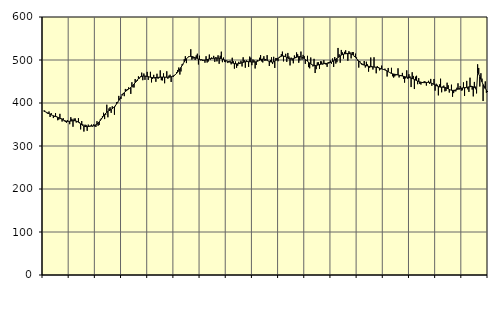
| Category | Piggar | Series 1 |
|---|---|---|
| nan | 381.7 | 381.25 |
| 87.0 | 382.6 | 380.11 |
| 87.0 | 379.4 | 379.08 |
| 87.0 | 376.4 | 377.77 |
| 87.0 | 374.8 | 376.44 |
| 87.0 | 380.2 | 375.11 |
| 87.0 | 367.5 | 373.76 |
| 87.0 | 376.6 | 372.53 |
| 87.0 | 371.6 | 371.38 |
| 87.0 | 365 | 370.36 |
| 87.0 | 367.8 | 369.47 |
| 87.0 | 376.4 | 368.62 |
| nan | 369.2 | 367.75 |
| 88.0 | 359.9 | 366.82 |
| 88.0 | 361.5 | 365.73 |
| 88.0 | 374.8 | 364.48 |
| 88.0 | 365 | 363.17 |
| 88.0 | 356.9 | 361.84 |
| 88.0 | 364.8 | 360.53 |
| 88.0 | 357.7 | 359.36 |
| 88.0 | 356 | 358.42 |
| 88.0 | 354.2 | 357.75 |
| 88.0 | 359.9 | 357.37 |
| 88.0 | 357 | 357.33 |
| nan | 350.7 | 357.54 |
| 89.0 | 367 | 357.94 |
| 89.0 | 363.1 | 358.45 |
| 89.0 | 344.8 | 358.84 |
| 89.0 | 363.7 | 358.91 |
| 89.0 | 364.2 | 358.63 |
| 89.0 | 354.6 | 357.93 |
| 89.0 | 355.9 | 356.77 |
| 89.0 | 364.7 | 355.23 |
| 89.0 | 355 | 353.4 |
| 89.0 | 338.6 | 351.46 |
| 89.0 | 358 | 349.54 |
| nan | 350.7 | 347.84 |
| 90.0 | 333.6 | 346.51 |
| 90.0 | 349.6 | 345.56 |
| 90.0 | 349 | 345.06 |
| 90.0 | 335.3 | 345.02 |
| 90.0 | 349.8 | 345.24 |
| 90.0 | 346.9 | 345.58 |
| 90.0 | 347.3 | 345.97 |
| 90.0 | 349.8 | 346.29 |
| 90.0 | 345.1 | 346.66 |
| 90.0 | 350.4 | 347.24 |
| 90.0 | 345.5 | 348.07 |
| nan | 344.3 | 349.27 |
| 91.0 | 357.7 | 350.99 |
| 91.0 | 347.1 | 353.24 |
| 91.0 | 348.9 | 356 |
| 91.0 | 361.7 | 359.19 |
| 91.0 | 364.9 | 362.67 |
| 91.0 | 369.5 | 366.3 |
| 91.0 | 377.3 | 369.9 |
| 91.0 | 362.6 | 373.23 |
| 91.0 | 372.6 | 376.14 |
| 91.0 | 396 | 378.52 |
| 91.0 | 366.8 | 380.4 |
| nan | 387.3 | 381.97 |
| 92.0 | 390.2 | 383.39 |
| 92.0 | 377.1 | 384.86 |
| 92.0 | 392.3 | 386.66 |
| 92.0 | 389.4 | 388.85 |
| 92.0 | 372.7 | 391.45 |
| 92.0 | 392.5 | 394.49 |
| 92.0 | 402 | 397.94 |
| 92.0 | 399.9 | 401.75 |
| 92.0 | 416.5 | 405.9 |
| 92.0 | 409.2 | 410.1 |
| 92.0 | 409.4 | 414.14 |
| nan | 420.6 | 417.97 |
| 93.0 | 422.9 | 421.32 |
| 93.0 | 415.9 | 424.16 |
| 93.0 | 432.7 | 426.56 |
| 93.0 | 431 | 428.57 |
| 93.0 | 432.1 | 430.4 |
| 93.0 | 436.4 | 432.25 |
| 93.0 | 434 | 434.11 |
| 93.0 | 421.2 | 436.15 |
| 93.0 | 448.3 | 438.45 |
| 93.0 | 436.4 | 441.09 |
| 93.0 | 436.1 | 444.11 |
| nan | 455.8 | 447.32 |
| 94.0 | 449.1 | 450.57 |
| 94.0 | 451.5 | 453.71 |
| 94.0 | 462 | 456.49 |
| 94.0 | 457.1 | 458.77 |
| 94.0 | 461.7 | 460.53 |
| 94.0 | 470.6 | 461.71 |
| 94.0 | 453 | 462.38 |
| 94.0 | 468.5 | 462.68 |
| 94.0 | 453.8 | 462.66 |
| 94.0 | 461.4 | 462.34 |
| 94.0 | 472.4 | 461.88 |
| nan | 453.7 | 461.25 |
| 95.0 | 460.7 | 460.54 |
| 95.0 | 472.5 | 459.93 |
| 95.0 | 447.9 | 459.44 |
| 95.0 | 455.9 | 459.15 |
| 95.0 | 465.5 | 459.08 |
| 95.0 | 457.3 | 459.11 |
| 95.0 | 449.3 | 459.23 |
| 95.0 | 468 | 459.43 |
| 95.0 | 456.3 | 459.62 |
| 95.0 | 458.7 | 459.87 |
| 95.0 | 475.9 | 460.09 |
| nan | 453 | 460.24 |
| 96.0 | 452.5 | 460.35 |
| 96.0 | 468.9 | 460.34 |
| 96.0 | 445.9 | 460.22 |
| 96.0 | 459.3 | 460.07 |
| 96.0 | 473.8 | 459.87 |
| 96.0 | 456.4 | 459.77 |
| 96.0 | 463.7 | 459.95 |
| 96.0 | 465.8 | 460.4 |
| 96.0 | 448.9 | 461.08 |
| 96.0 | 462.4 | 461.99 |
| 96.0 | 460.8 | 463.09 |
| nan | 463.4 | 464.51 |
| 97.0 | 467.3 | 466.44 |
| 97.0 | 471.6 | 468.91 |
| 97.0 | 476.8 | 471.88 |
| 97.0 | 482.5 | 475.27 |
| 97.0 | 466.2 | 478.94 |
| 97.0 | 473.4 | 482.87 |
| 97.0 | 490.1 | 487.02 |
| 97.0 | 490.1 | 491.27 |
| 97.0 | 501.8 | 495.46 |
| 97.0 | 508.8 | 499.33 |
| 97.0 | 492.8 | 502.7 |
| nan | 504.8 | 505.36 |
| 98.0 | 508.1 | 507.21 |
| 98.0 | 508.5 | 508.2 |
| 98.0 | 525 | 508.43 |
| 98.0 | 500.8 | 508.05 |
| 98.0 | 503.5 | 507.34 |
| 98.0 | 503.8 | 506.44 |
| 98.0 | 500.1 | 505.45 |
| 98.0 | 510.6 | 504.43 |
| 98.0 | 514.6 | 503.38 |
| 98.0 | 489.6 | 502.35 |
| 98.0 | 510 | 501.44 |
| nan | 499.3 | 500.72 |
| 99.0 | 501.4 | 500.16 |
| 99.0 | 497.9 | 499.8 |
| 99.0 | 498.9 | 499.65 |
| 99.0 | 493.7 | 499.78 |
| 99.0 | 508.8 | 500.23 |
| 99.0 | 494.1 | 500.95 |
| 99.0 | 496.5 | 501.8 |
| 99.0 | 512.7 | 502.55 |
| 99.0 | 500.9 | 503.13 |
| 99.0 | 505.8 | 503.52 |
| 99.0 | 504.7 | 503.81 |
| nan | 509.6 | 503.98 |
| 0.0 | 495.7 | 504.11 |
| 0.0 | 506.8 | 504.21 |
| 0.0 | 496.8 | 504.28 |
| 0.0 | 510.9 | 504.24 |
| 0.0 | 491.2 | 504.08 |
| 0.0 | 509.8 | 503.68 |
| 0.0 | 519.4 | 503.05 |
| 0.0 | 494.9 | 502.24 |
| 0.0 | 505.7 | 501.23 |
| 0.0 | 495.6 | 500.16 |
| 0.0 | 494.8 | 499.09 |
| nan | 498.1 | 498.02 |
| 1.0 | 492.9 | 496.97 |
| 1.0 | 497 | 495.96 |
| 1.0 | 498.5 | 495.01 |
| 1.0 | 489.9 | 494.11 |
| 1.0 | 505.2 | 493.21 |
| 1.0 | 497.1 | 492.43 |
| 1.0 | 479.9 | 491.74 |
| 1.0 | 496.6 | 491.21 |
| 1.0 | 481.8 | 491.03 |
| 1.0 | 486.5 | 491.14 |
| 1.0 | 495.8 | 491.5 |
| nan | 493.1 | 492.09 |
| 2.0 | 498.3 | 492.83 |
| 2.0 | 485 | 493.62 |
| 2.0 | 506.3 | 494.44 |
| 2.0 | 499.7 | 495.24 |
| 2.0 | 482 | 495.88 |
| 2.0 | 499.1 | 496.26 |
| 2.0 | 497.3 | 496.38 |
| 2.0 | 483.9 | 496.24 |
| 2.0 | 507.9 | 495.92 |
| 2.0 | 505.4 | 495.62 |
| 2.0 | 487.9 | 495.35 |
| nan | 501.2 | 495.2 |
| 3.0 | 499.3 | 495.27 |
| 3.0 | 480.3 | 495.55 |
| 3.0 | 488.3 | 496.08 |
| 3.0 | 499.9 | 496.9 |
| 3.0 | 497.6 | 498.01 |
| 3.0 | 505.2 | 499.32 |
| 3.0 | 511.5 | 500.61 |
| 3.0 | 496.7 | 501.63 |
| 3.0 | 494.3 | 502.22 |
| 3.0 | 508.8 | 502.2 |
| 3.0 | 497.7 | 501.58 |
| nan | 500.5 | 500.51 |
| 4.0 | 511.3 | 499.16 |
| 4.0 | 497.4 | 497.78 |
| 4.0 | 486.1 | 496.59 |
| 4.0 | 499.9 | 495.66 |
| 4.0 | 506.4 | 495.17 |
| 4.0 | 490.6 | 495.26 |
| 4.0 | 507.4 | 495.93 |
| 4.0 | 481.5 | 497.24 |
| 4.0 | 504.7 | 499.09 |
| 4.0 | 504.4 | 501.23 |
| 4.0 | 497.2 | 503.49 |
| nan | 507.1 | 505.62 |
| 5.0 | 508.5 | 507.4 |
| 5.0 | 513.6 | 508.67 |
| 5.0 | 519.5 | 509.35 |
| 5.0 | 496.8 | 509.37 |
| 5.0 | 507.7 | 508.68 |
| 5.0 | 514.4 | 507.43 |
| 5.0 | 495.6 | 505.94 |
| 5.0 | 516.4 | 504.52 |
| 5.0 | 508.2 | 503.4 |
| 5.0 | 487.4 | 502.68 |
| 5.0 | 505.5 | 502.42 |
| nan | 498.9 | 502.62 |
| 6.0 | 492.3 | 503.24 |
| 6.0 | 510.6 | 504.17 |
| 6.0 | 507.1 | 505.19 |
| 6.0 | 517.6 | 506.22 |
| 6.0 | 513.4 | 507.18 |
| 6.0 | 493.6 | 507.77 |
| 6.0 | 499.3 | 507.83 |
| 6.0 | 519.6 | 507.34 |
| 6.0 | 500.9 | 506.22 |
| 6.0 | 511.9 | 504.73 |
| 6.0 | 508.9 | 503.07 |
| nan | 491 | 501.24 |
| 7.0 | 499.7 | 499.26 |
| 7.0 | 509.7 | 497.2 |
| 7.0 | 483.4 | 495.04 |
| 7.0 | 480.7 | 492.87 |
| 7.0 | 505.8 | 490.86 |
| 7.0 | 488.8 | 489.22 |
| 7.0 | 485 | 488.08 |
| 7.0 | 502.7 | 487.42 |
| 7.0 | 469.7 | 487.22 |
| 7.0 | 478.7 | 487.43 |
| 7.0 | 494.5 | 487.9 |
| nan | 494.7 | 488.54 |
| 8.0 | 479.4 | 489.26 |
| 8.0 | 497.1 | 489.92 |
| 8.0 | 496.6 | 490.54 |
| 8.0 | 489.5 | 491.1 |
| 8.0 | 499.5 | 491.5 |
| 8.0 | 493.3 | 491.72 |
| 8.0 | 489.2 | 491.88 |
| 8.0 | 484 | 492.08 |
| 8.0 | 495.1 | 492.49 |
| 8.0 | 495.3 | 493.21 |
| 8.0 | 498.8 | 494.15 |
| nan | 491.5 | 495.32 |
| 9.0 | 503.5 | 496.71 |
| 9.0 | 483.8 | 498.27 |
| 9.0 | 506.8 | 499.91 |
| 9.0 | 491.7 | 501.73 |
| 9.0 | 494.9 | 503.7 |
| 9.0 | 528 | 505.72 |
| 9.0 | 513.3 | 507.75 |
| 9.0 | 493.7 | 509.68 |
| 9.0 | 523.4 | 511.36 |
| 9.0 | 517.8 | 512.67 |
| 9.0 | 503.3 | 513.59 |
| nan | 519 | 514.17 |
| 10.0 | 522.6 | 514.52 |
| 10.0 | 515.7 | 514.78 |
| 10.0 | 498.2 | 514.97 |
| 10.0 | 520.4 | 514.95 |
| 10.0 | 517.7 | 514.68 |
| 10.0 | 503.7 | 514.07 |
| 10.0 | 518.6 | 512.94 |
| 10.0 | 518.3 | 511.29 |
| 10.0 | 507.3 | 509.1 |
| 10.0 | 514.8 | 506.37 |
| 10.0 | 505.9 | 503.4 |
| nan | 498.8 | 500.4 |
| 11.0 | 482.4 | 497.51 |
| 11.0 | 497.4 | 494.9 |
| 11.0 | 491.7 | 492.72 |
| 11.0 | 488.5 | 490.91 |
| 11.0 | 488 | 489.38 |
| 11.0 | 497.7 | 488.21 |
| 11.0 | 482.6 | 487.35 |
| 11.0 | 495.9 | 486.64 |
| 11.0 | 489.9 | 486.04 |
| 11.0 | 472.9 | 485.52 |
| 11.0 | 481.9 | 485 |
| nan | 505.8 | 484.55 |
| 12.0 | 486.1 | 484.19 |
| 12.0 | 477.8 | 483.92 |
| 12.0 | 506.3 | 483.65 |
| 12.0 | 482.9 | 483.41 |
| 12.0 | 469.1 | 483.12 |
| 12.0 | 485.7 | 482.67 |
| 12.0 | 483.7 | 482.03 |
| 12.0 | 475.9 | 481.19 |
| 12.0 | 478.1 | 480.22 |
| 12.0 | 487 | 479.29 |
| 12.0 | 478.1 | 478.49 |
| nan | 477.9 | 477.73 |
| 13.0 | 479.8 | 476.89 |
| 13.0 | 475.5 | 475.81 |
| 13.0 | 461.6 | 474.47 |
| 13.0 | 481.5 | 472.94 |
| 13.0 | 471.3 | 471.46 |
| 13.0 | 469.4 | 470.08 |
| 13.0 | 481.8 | 468.86 |
| 13.0 | 462.2 | 467.94 |
| 13.0 | 459.1 | 467.32 |
| 13.0 | 461.9 | 466.81 |
| 13.0 | 464.2 | 466.31 |
| nan | 466.8 | 465.76 |
| 14.0 | 480.7 | 465.14 |
| 14.0 | 459.4 | 464.56 |
| 14.0 | 462.6 | 464 |
| 14.0 | 464.8 | 463.38 |
| 14.0 | 470 | 462.74 |
| 14.0 | 456.5 | 462.1 |
| 14.0 | 447.4 | 461.4 |
| 14.0 | 457.2 | 460.72 |
| 14.0 | 475.9 | 460.14 |
| 14.0 | 456.1 | 459.65 |
| 14.0 | 467 | 459.2 |
| nan | 461.9 | 458.68 |
| 15.0 | 437.1 | 457.98 |
| 15.0 | 471.5 | 457.05 |
| 15.0 | 463 | 455.94 |
| 15.0 | 432.5 | 454.71 |
| 15.0 | 461.2 | 453.41 |
| 15.0 | 463.3 | 452.14 |
| 15.0 | 443.7 | 451.02 |
| 15.0 | 457.8 | 450.02 |
| 15.0 | 444.3 | 449.13 |
| 15.0 | 442.9 | 448.35 |
| 15.0 | 447.6 | 447.75 |
| nan | 447 | 447.39 |
| 16.0 | 450.9 | 447.32 |
| 16.0 | 449.7 | 447.45 |
| 16.0 | 440.5 | 447.7 |
| 16.0 | 448.8 | 447.98 |
| 16.0 | 451.6 | 448.04 |
| 16.0 | 444.5 | 447.7 |
| 16.0 | 456 | 446.96 |
| 16.0 | 440 | 445.89 |
| 16.0 | 444.4 | 444.6 |
| 16.0 | 455.9 | 443.27 |
| 16.0 | 428.7 | 441.91 |
| nan | 444.8 | 440.54 |
| 17.0 | 442.3 | 439.29 |
| 17.0 | 417.7 | 438.27 |
| 17.0 | 443.2 | 437.48 |
| 17.0 | 456.5 | 436.99 |
| 17.0 | 424.9 | 436.74 |
| 17.0 | 438.2 | 436.61 |
| 17.0 | 440.5 | 436.45 |
| 17.0 | 427.1 | 436.06 |
| 17.0 | 428.2 | 435.33 |
| 17.0 | 447.2 | 434.25 |
| 17.0 | 441.2 | 432.91 |
| nan | 424.3 | 431.61 |
| 18.0 | 430.6 | 430.5 |
| 18.0 | 442.6 | 429.71 |
| 18.0 | 414.5 | 429.4 |
| 18.0 | 423 | 429.48 |
| 18.0 | 427.4 | 429.85 |
| 18.0 | 427.1 | 430.56 |
| 18.0 | 435.5 | 431.51 |
| 18.0 | 445.8 | 432.48 |
| 18.0 | 431 | 433.35 |
| 18.0 | 439.5 | 434.03 |
| 18.0 | 428.8 | 434.58 |
| nan | 429.6 | 435.02 |
| 19.0 | 448 | 435.37 |
| 19.0 | 416.4 | 435.69 |
| 19.0 | 434.6 | 436 |
| 19.0 | 451.4 | 436.37 |
| 19.0 | 431.7 | 436.9 |
| 19.0 | 425.8 | 437.49 |
| 19.0 | 458.8 | 437.96 |
| 19.0 | 439.9 | 438.29 |
| 19.0 | 431.2 | 438.3 |
| 19.0 | 415.4 | 437.67 |
| 19.0 | 449 | 436.17 |
| nan | 438 | 433.68 |
| 20.0 | 422.3 | 430.08 |
| 20.0 | 490 | 469.39 |
| 20.0 | 481.5 | 467.57 |
| 20.0 | 438.4 | 461.45 |
| 20.0 | 469.2 | 455.43 |
| 20.0 | 456.6 | 449.06 |
| 20.0 | 404.6 | 443.08 |
| 20.0 | 439.9 | 437.73 |
| 20.0 | 450.2 | 433.37 |
| 20.0 | 423.8 | 430.11 |
| 20.0 | 425.7 | 427.78 |